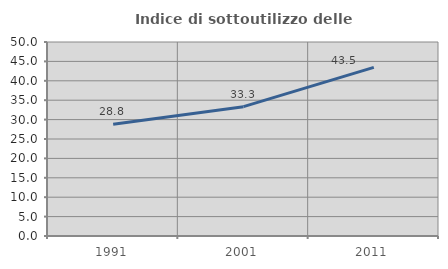
| Category | Indice di sottoutilizzo delle abitazioni  |
|---|---|
| 1991.0 | 28.8 |
| 2001.0 | 33.333 |
| 2011.0 | 43.456 |